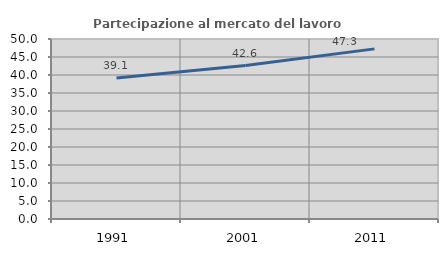
| Category | Partecipazione al mercato del lavoro  femminile |
|---|---|
| 1991.0 | 39.146 |
| 2001.0 | 42.634 |
| 2011.0 | 47.26 |